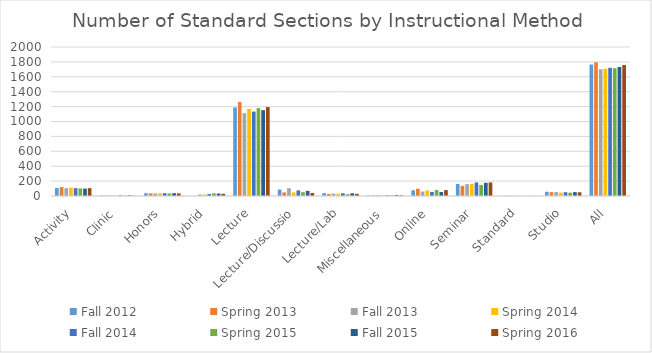
| Category | Fall 2012 | Spring 2013 | Fall 2013 | Spring 2014 | Fall 2014 | Spring 2015 | Fall 2015 | Spring 2016 |
|---|---|---|---|---|---|---|---|---|
| Activity | 107 | 120 | 105 | 112 | 105 | 102 | 99 | 105 |
| Clinic | 6 | 6 | 7 | 5 | 9 | 4 | 9 | 3 |
| Honors | 37 | 35 | 35 | 36 | 38 | 34 | 38 | 35 |
| Hybrid | 0 | 1 | 20 | 20 | 27 | 36 | 33 | 30 |
| Lecture | 1189 | 1261 | 1113 | 1168 | 1133 | 1179 | 1152 | 1194 |
| Lecture/Discussio | 87 | 48 | 104 | 49 | 75 | 51 | 69 | 41 |
| Lecture/Lab | 38 | 27 | 33 | 29 | 37 | 24 | 37 | 29 |
| Miscellaneous | 7 | 7 | 11 | 8 | 9 | 10 | 14 | 9 |
| Online | 77 | 98 | 59 | 75 | 55 | 80 | 53 | 79 |
| Seminar | 161 | 136 | 159 | 160 | 182 | 149 | 177 | 182 |
| Standard | 0 | 4 | 2 | 0 | 0 | 1 | 0 | 1 |
| Studio | 57 | 52 | 53 | 46 | 51 | 45 | 52 | 50 |
| All | 1766 | 1795 | 1701 | 1708 | 1721 | 1715 | 1733 | 1758 |